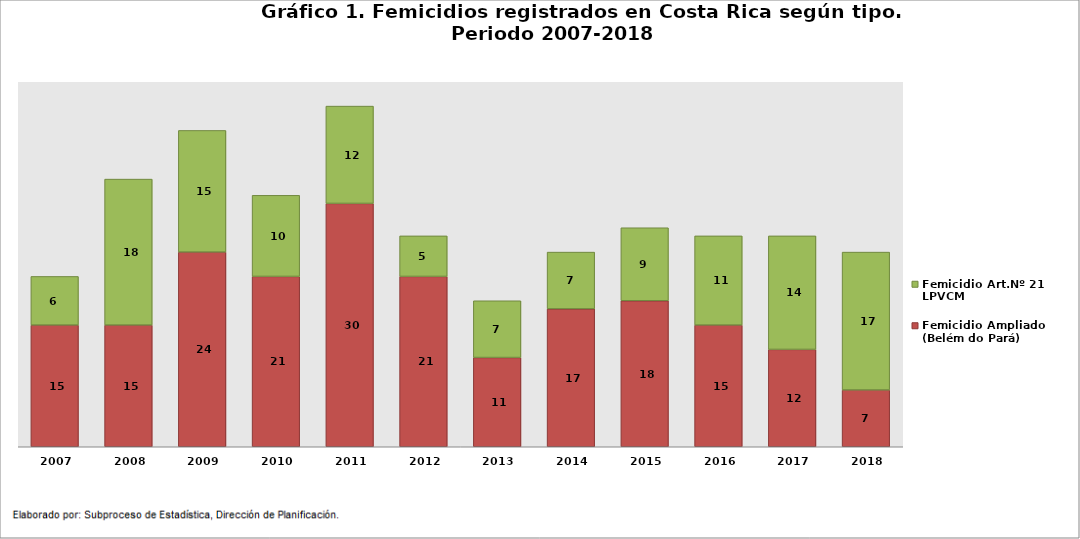
| Category | Femicidio Ampliado (Belém do Pará) | Femicidio Art.Nº 21 LPVCM |
|---|---|---|
| 2007.0 | 15 | 6 |
| 2008.0 | 15 | 18 |
| 2009.0 | 24 | 15 |
| 2010.0 | 21 | 10 |
| 2011.0 | 30 | 12 |
| 2012.0 | 21 | 5 |
| 2013.0 | 11 | 7 |
| 2014.0 | 17 | 7 |
| 2015.0 | 18 | 9 |
| 2016.0 | 15 | 11 |
| 2017.0 | 12 | 14 |
| 2018.0 | 7 | 17 |